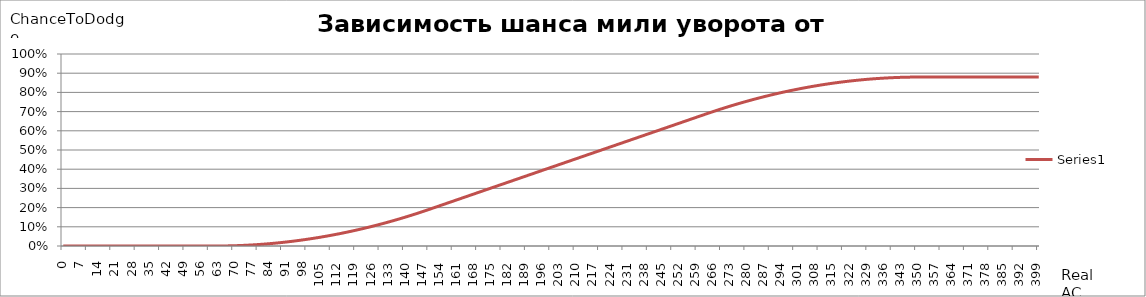
| Category | Series 1 |
|---|---|
| 0.0 | 0 |
| 1.0 | 0 |
| 2.0 | 0 |
| 3.0 | 0 |
| 4.0 | 0 |
| 5.0 | 0 |
| 6.0 | 0 |
| 7.0 | 0 |
| 8.0 | 0 |
| 9.0 | 0 |
| 10.0 | 0 |
| 11.0 | 0 |
| 12.0 | 0 |
| 13.0 | 0 |
| 14.0 | 0 |
| 15.0 | 0 |
| 16.0 | 0 |
| 17.0 | 0 |
| 18.0 | 0 |
| 19.0 | 0 |
| 20.0 | 0 |
| 21.0 | 0 |
| 22.0 | 0 |
| 23.0 | 0 |
| 24.0 | 0 |
| 25.0 | 0 |
| 26.0 | 0 |
| 27.0 | 0 |
| 28.0 | 0 |
| 29.0 | 0 |
| 30.0 | 0 |
| 31.0 | 0 |
| 32.0 | 0 |
| 33.0 | 0 |
| 34.0 | 0 |
| 35.0 | 0 |
| 36.0 | 0 |
| 37.0 | 0 |
| 38.0 | 0 |
| 39.0 | 0 |
| 40.0 | 0 |
| 41.0 | 0 |
| 42.0 | 0 |
| 43.0 | 0 |
| 44.0 | 0 |
| 45.0 | 0 |
| 46.0 | 0 |
| 47.0 | 0 |
| 48.0 | 0 |
| 49.0 | 0 |
| 50.0 | 0 |
| 51.0 | 0 |
| 52.0 | 0 |
| 53.0 | 0 |
| 54.0 | 0 |
| 55.0 | 0 |
| 56.0 | 0 |
| 57.0 | 0 |
| 58.0 | 0 |
| 59.0 | 0 |
| 60.0 | 0 |
| 61.0 | 0 |
| 62.0 | 0 |
| 63.0 | 0 |
| 64.0 | 0 |
| 65.0 | 0 |
| 66.0 | 0 |
| 67.0 | 0 |
| 68.0 | 0.001 |
| 69.0 | 0.001 |
| 70.0 | 0.001 |
| 71.0 | 0.002 |
| 72.0 | 0.002 |
| 73.0 | 0.003 |
| 74.0 | 0.003 |
| 75.0 | 0.004 |
| 76.0 | 0.005 |
| 77.0 | 0.005 |
| 78.0 | 0.006 |
| 79.0 | 0.007 |
| 80.0 | 0.008 |
| 81.0 | 0.009 |
| 82.0 | 0.009 |
| 83.0 | 0.01 |
| 84.0 | 0.011 |
| 85.0 | 0.013 |
| 86.0 | 0.014 |
| 87.0 | 0.015 |
| 88.0 | 0.016 |
| 89.0 | 0.017 |
| 90.0 | 0.019 |
| 91.0 | 0.02 |
| 92.0 | 0.022 |
| 93.0 | 0.023 |
| 94.0 | 0.025 |
| 95.0 | 0.026 |
| 96.0 | 0.028 |
| 97.0 | 0.03 |
| 98.0 | 0.031 |
| 99.0 | 0.033 |
| 100.0 | 0.035 |
| 101.0 | 0.037 |
| 102.0 | 0.039 |
| 103.0 | 0.041 |
| 104.0 | 0.043 |
| 105.0 | 0.045 |
| 106.0 | 0.047 |
| 107.0 | 0.049 |
| 108.0 | 0.051 |
| 109.0 | 0.054 |
| 110.0 | 0.056 |
| 111.0 | 0.059 |
| 112.0 | 0.061 |
| 113.0 | 0.063 |
| 114.0 | 0.066 |
| 115.0 | 0.069 |
| 116.0 | 0.071 |
| 117.0 | 0.074 |
| 118.0 | 0.077 |
| 119.0 | 0.079 |
| 120.0 | 0.082 |
| 121.0 | 0.085 |
| 122.0 | 0.088 |
| 123.0 | 0.091 |
| 124.0 | 0.094 |
| 125.0 | 0.097 |
| 126.0 | 0.1 |
| 127.0 | 0.103 |
| 128.0 | 0.107 |
| 129.0 | 0.11 |
| 130.0 | 0.113 |
| 131.0 | 0.117 |
| 132.0 | 0.12 |
| 133.0 | 0.124 |
| 134.0 | 0.127 |
| 135.0 | 0.131 |
| 136.0 | 0.134 |
| 137.0 | 0.138 |
| 138.0 | 0.142 |
| 139.0 | 0.146 |
| 140.0 | 0.149 |
| 141.0 | 0.153 |
| 142.0 | 0.157 |
| 143.0 | 0.161 |
| 144.0 | 0.165 |
| 145.0 | 0.169 |
| 146.0 | 0.173 |
| 147.0 | 0.178 |
| 148.0 | 0.182 |
| 149.0 | 0.186 |
| 150.0 | 0.19 |
| 151.0 | 0.195 |
| 152.0 | 0.199 |
| 153.0 | 0.204 |
| 154.0 | 0.208 |
| 155.0 | 0.212 |
| 156.0 | 0.217 |
| 157.0 | 0.221 |
| 158.0 | 0.225 |
| 159.0 | 0.23 |
| 160.0 | 0.234 |
| 161.0 | 0.239 |
| 162.0 | 0.243 |
| 163.0 | 0.247 |
| 164.0 | 0.252 |
| 165.0 | 0.256 |
| 166.0 | 0.26 |
| 167.0 | 0.265 |
| 168.0 | 0.269 |
| 169.0 | 0.274 |
| 170.0 | 0.278 |
| 171.0 | 0.282 |
| 172.0 | 0.287 |
| 173.0 | 0.291 |
| 174.0 | 0.296 |
| 175.0 | 0.3 |
| 176.0 | 0.304 |
| 177.0 | 0.309 |
| 178.0 | 0.313 |
| 179.0 | 0.317 |
| 180.0 | 0.322 |
| 181.0 | 0.326 |
| 182.0 | 0.331 |
| 183.0 | 0.335 |
| 184.0 | 0.339 |
| 185.0 | 0.344 |
| 186.0 | 0.348 |
| 187.0 | 0.352 |
| 188.0 | 0.357 |
| 189.0 | 0.361 |
| 190.0 | 0.366 |
| 191.0 | 0.37 |
| 192.0 | 0.374 |
| 193.0 | 0.379 |
| 194.0 | 0.383 |
| 195.0 | 0.387 |
| 196.0 | 0.392 |
| 197.0 | 0.396 |
| 198.0 | 0.401 |
| 199.0 | 0.405 |
| 200.0 | 0.409 |
| 201.0 | 0.414 |
| 202.0 | 0.418 |
| 203.0 | 0.422 |
| 204.0 | 0.427 |
| 205.0 | 0.431 |
| 206.0 | 0.436 |
| 207.0 | 0.44 |
| 208.0 | 0.444 |
| 209.0 | 0.449 |
| 210.0 | 0.453 |
| 211.0 | 0.458 |
| 212.0 | 0.462 |
| 213.0 | 0.466 |
| 214.0 | 0.471 |
| 215.0 | 0.475 |
| 216.0 | 0.479 |
| 217.0 | 0.484 |
| 218.0 | 0.488 |
| 219.0 | 0.493 |
| 220.0 | 0.497 |
| 221.0 | 0.501 |
| 222.0 | 0.506 |
| 223.0 | 0.51 |
| 224.0 | 0.514 |
| 225.0 | 0.519 |
| 226.0 | 0.523 |
| 227.0 | 0.528 |
| 228.0 | 0.532 |
| 229.0 | 0.536 |
| 230.0 | 0.541 |
| 231.0 | 0.545 |
| 232.0 | 0.549 |
| 233.0 | 0.554 |
| 234.0 | 0.558 |
| 235.0 | 0.563 |
| 236.0 | 0.567 |
| 237.0 | 0.571 |
| 238.0 | 0.576 |
| 239.0 | 0.58 |
| 240.0 | 0.584 |
| 241.0 | 0.589 |
| 242.0 | 0.593 |
| 243.0 | 0.598 |
| 244.0 | 0.602 |
| 245.0 | 0.606 |
| 246.0 | 0.611 |
| 247.0 | 0.615 |
| 248.0 | 0.62 |
| 249.0 | 0.624 |
| 250.0 | 0.628 |
| 251.0 | 0.633 |
| 252.0 | 0.637 |
| 253.0 | 0.641 |
| 254.0 | 0.646 |
| 255.0 | 0.65 |
| 256.0 | 0.655 |
| 257.0 | 0.659 |
| 258.0 | 0.663 |
| 259.0 | 0.668 |
| 260.0 | 0.672 |
| 261.0 | 0.676 |
| 262.0 | 0.681 |
| 263.0 | 0.685 |
| 264.0 | 0.69 |
| 265.0 | 0.694 |
| 266.0 | 0.698 |
| 267.0 | 0.702 |
| 268.0 | 0.707 |
| 269.0 | 0.711 |
| 270.0 | 0.715 |
| 271.0 | 0.719 |
| 272.0 | 0.723 |
| 273.0 | 0.727 |
| 274.0 | 0.731 |
| 275.0 | 0.734 |
| 276.0 | 0.738 |
| 277.0 | 0.742 |
| 278.0 | 0.746 |
| 279.0 | 0.749 |
| 280.0 | 0.753 |
| 281.0 | 0.756 |
| 282.0 | 0.76 |
| 283.0 | 0.763 |
| 284.0 | 0.767 |
| 285.0 | 0.77 |
| 286.0 | 0.773 |
| 287.0 | 0.777 |
| 288.0 | 0.78 |
| 289.0 | 0.783 |
| 290.0 | 0.786 |
| 291.0 | 0.789 |
| 292.0 | 0.792 |
| 293.0 | 0.795 |
| 294.0 | 0.798 |
| 295.0 | 0.801 |
| 296.0 | 0.803 |
| 297.0 | 0.806 |
| 298.0 | 0.809 |
| 299.0 | 0.811 |
| 300.0 | 0.814 |
| 301.0 | 0.817 |
| 302.0 | 0.819 |
| 303.0 | 0.821 |
| 304.0 | 0.824 |
| 305.0 | 0.826 |
| 306.0 | 0.829 |
| 307.0 | 0.831 |
| 308.0 | 0.833 |
| 309.0 | 0.835 |
| 310.0 | 0.837 |
| 311.0 | 0.839 |
| 312.0 | 0.841 |
| 313.0 | 0.843 |
| 314.0 | 0.845 |
| 315.0 | 0.847 |
| 316.0 | 0.849 |
| 317.0 | 0.85 |
| 318.0 | 0.852 |
| 319.0 | 0.854 |
| 320.0 | 0.855 |
| 321.0 | 0.857 |
| 322.0 | 0.858 |
| 323.0 | 0.86 |
| 324.0 | 0.861 |
| 325.0 | 0.863 |
| 326.0 | 0.864 |
| 327.0 | 0.865 |
| 328.0 | 0.866 |
| 329.0 | 0.867 |
| 330.0 | 0.869 |
| 331.0 | 0.87 |
| 332.0 | 0.871 |
| 333.0 | 0.871 |
| 334.0 | 0.872 |
| 335.0 | 0.873 |
| 336.0 | 0.874 |
| 337.0 | 0.875 |
| 338.0 | 0.875 |
| 339.0 | 0.876 |
| 340.0 | 0.877 |
| 341.0 | 0.877 |
| 342.0 | 0.878 |
| 343.0 | 0.878 |
| 344.0 | 0.879 |
| 345.0 | 0.879 |
| 346.0 | 0.879 |
| 347.0 | 0.88 |
| 348.0 | 0.88 |
| 349.0 | 0.88 |
| 350.0 | 0.88 |
| 351.0 | 0.88 |
| 352.0 | 0.88 |
| 353.0 | 0.88 |
| 354.0 | 0.88 |
| 355.0 | 0.88 |
| 356.0 | 0.88 |
| 357.0 | 0.88 |
| 358.0 | 0.88 |
| 359.0 | 0.88 |
| 360.0 | 0.88 |
| 361.0 | 0.88 |
| 362.0 | 0.88 |
| 363.0 | 0.88 |
| 364.0 | 0.88 |
| 365.0 | 0.88 |
| 366.0 | 0.88 |
| 367.0 | 0.88 |
| 368.0 | 0.88 |
| 369.0 | 0.88 |
| 370.0 | 0.88 |
| 371.0 | 0.88 |
| 372.0 | 0.88 |
| 373.0 | 0.88 |
| 374.0 | 0.88 |
| 375.0 | 0.88 |
| 376.0 | 0.88 |
| 377.0 | 0.88 |
| 378.0 | 0.88 |
| 379.0 | 0.88 |
| 380.0 | 0.88 |
| 381.0 | 0.88 |
| 382.0 | 0.88 |
| 383.0 | 0.88 |
| 384.0 | 0.88 |
| 385.0 | 0.88 |
| 386.0 | 0.88 |
| 387.0 | 0.88 |
| 388.0 | 0.88 |
| 389.0 | 0.88 |
| 390.0 | 0.88 |
| 391.0 | 0.88 |
| 392.0 | 0.88 |
| 393.0 | 0.88 |
| 394.0 | 0.88 |
| 395.0 | 0.88 |
| 396.0 | 0.88 |
| 397.0 | 0.88 |
| 398.0 | 0.88 |
| 399.0 | 0.88 |
| 400.0 | 0.88 |